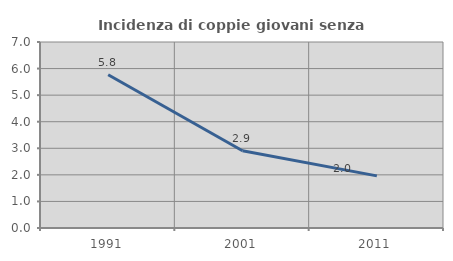
| Category | Incidenza di coppie giovani senza figli |
|---|---|
| 1991.0 | 5.769 |
| 2001.0 | 2.908 |
| 2011.0 | 1.961 |